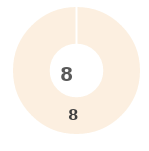
| Category | Series 0 |
|---|---|
| 0 | 0 |
| 1 | 0 |
| 2 | 0 |
| 3 | 0 |
| 4 | 8 |